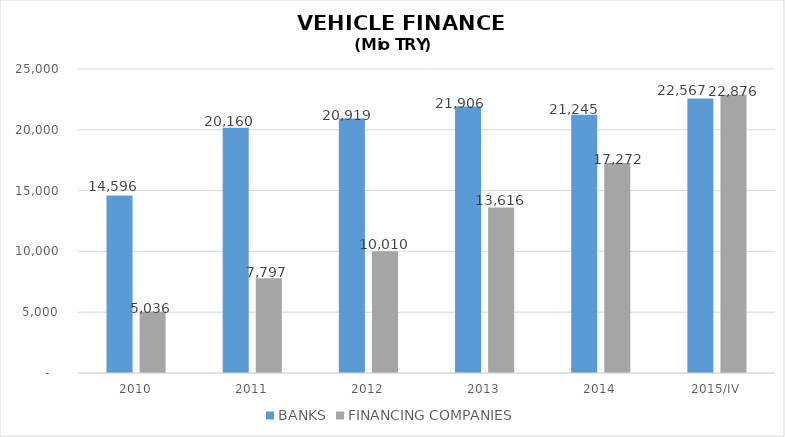
| Category | BANKS | FINANCING COMPANIES |
|---|---|---|
| 2010 | 14596 | 5035.89 |
| 2011 | 20160 | 7796.854 |
| 2012 | 20919 | 10009.755 |
| 2013 | 21906 | 13616.036 |
| 2014 | 21245 | 17271.844 |
| 2015/IV | 22567 | 22875.563 |